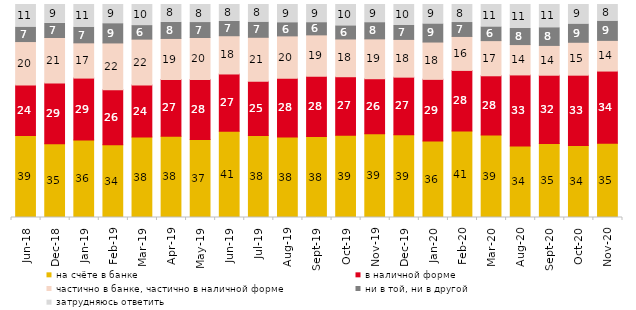
| Category | на счёте в банке | в наличной форме | частично в банке, частично в наличной форме | ни в той, ни в другой | затрудняюсь ответить |
|---|---|---|---|---|---|
| 2018-06-01 | 38.5 | 23.65 | 20.45 | 6.8 | 10.6 |
| 2018-12-01 | 34.6 | 28.55 | 21.35 | 6.65 | 8.85 |
| 2019-01-01 | 36.35 | 29.1 | 16.55 | 7.35 | 10.65 |
| 2019-02-01 | 34.2 | 25.75 | 22 | 9.05 | 9 |
| 2019-03-01 | 37.842 | 24.316 | 21.581 | 6.365 | 9.896 |
| 2019-04-01 | 38.119 | 26.634 | 19.307 | 7.574 | 8.366 |
| 2019-05-01 | 36.652 | 28.083 | 19.762 | 7.033 | 8.47 |
| 2019-06-01 | 40.549 | 26.833 | 17.955 | 6.733 | 7.93 |
| 2019-07-01 | 38.465 | 25.495 | 20.644 | 7.129 | 8.267 |
| 2019-08-01 | 37.812 | 27.522 | 19.93 | 6.194 | 8.541 |
| 2019-09-01 | 37.97 | 28.366 | 19.406 | 5.743 | 8.515 |
| 2019-10-01 | 38.663 | 27.426 | 17.723 | 6.188 | 10 |
| 2019-11-01 | 39.356 | 25.792 | 18.713 | 7.624 | 8.515 |
| 2019-12-01 | 38.812 | 27.079 | 17.723 | 6.535 | 9.851 |
| 2020-01-01 | 35.941 | 28.911 | 17.525 | 8.515 | 9.109 |
| 2020-02-01 | 40.644 | 28.416 | 15.941 | 6.535 | 8.465 |
| 2020-03-01 | 38.77 | 27.764 | 16.51 | 6.445 | 10.511 |
| 2020-08-01 | 33.565 | 33.366 | 14.25 | 7.547 | 11.271 |
| 2020-09-01 | 34.744 | 32.056 | 13.987 | 8.313 | 10.901 |
| 2020-10-01 | 33.832 | 32.985 | 15.446 | 8.57 | 9.168 |
| 2020-11-01 | 34.85 | 33.9 | 14.4 | 9.05 | 7.8 |